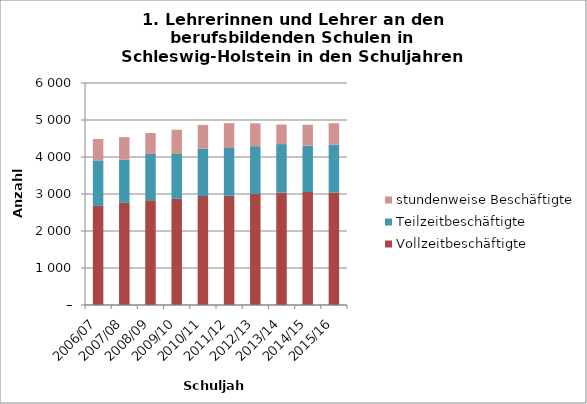
| Category | Vollzeitbeschäftigte | Teilzeitbeschäftigte | stundenweise Beschäftigte |
|---|---|---|---|
| 2006/07 | 2678 | 1230 | 578 |
| 2007/08 | 2762 | 1166 | 608 |
| 2008/09 | 2831 | 1252 | 565 |
| 2009/10 | 2870 | 1211 | 656 |
| 2010/11 | 2946 | 1283 | 638 |
| 2011/12 | 2952 | 1291 | 672 |
| 2012/13 | 3001 | 1292 | 617 |
| 2013/14 | 3036 | 1313 | 528 |
| 2014/15 | 3053 | 1254 | 564 |
| 2015/16 | 3038 | 1301 | 574 |